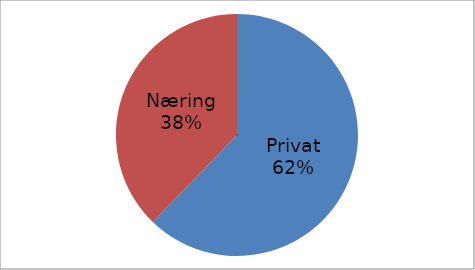
| Category | Series 0 |
|---|---|
| Privat | 34693583 |
| Næring | 21050177 |